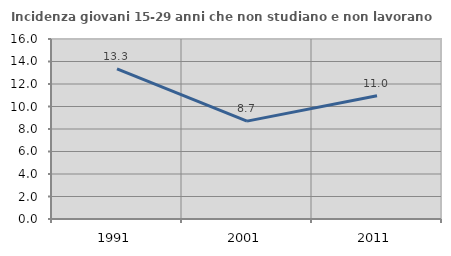
| Category | Incidenza giovani 15-29 anni che non studiano e non lavorano  |
|---|---|
| 1991.0 | 13.347 |
| 2001.0 | 8.702 |
| 2011.0 | 10.952 |